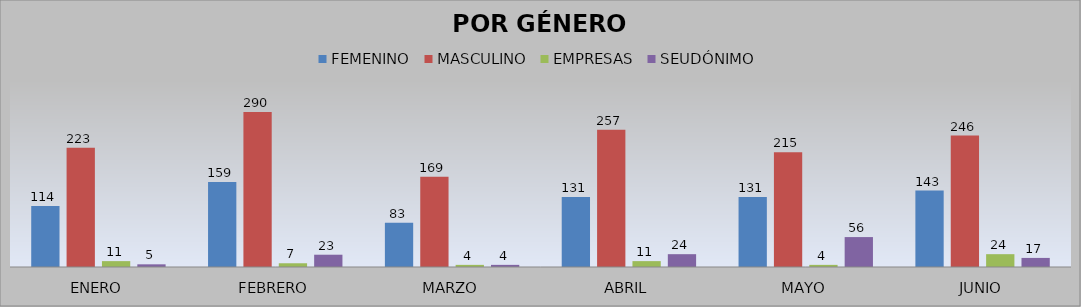
| Category | FEMENINO | MASCULINO | EMPRESAS | SEUDÓNIMO |
|---|---|---|---|---|
| ENERO | 114 | 223 | 11 | 5 |
| FEBRERO | 159 | 290 | 7 | 23 |
| MARZO | 83 | 169 | 4 | 4 |
| ABRIL | 131 | 257 | 11 | 24 |
| MAYO | 131 | 215 | 4 | 56 |
| JUNIO | 143 | 246 | 24 | 17 |